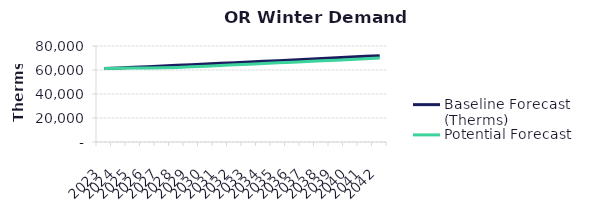
| Category | Baseline Forecast (Therms) | Potential Forecast |
|---|---|---|
| 2023.0 | 61225.348 | 61225.348 |
| 2024.0 | 61621.184 | 61460.07 |
| 2025.0 | 62189.655 | 61700.29 |
| 2026.0 | 62806.427 | 61650.526 |
| 2027.0 | 63342.783 | 61833.669 |
| 2028.0 | 63883.831 | 62181.077 |
| 2029.0 | 64429.61 | 62700.436 |
| 2030.0 | 64980.164 | 63224.098 |
| 2031.0 | 65535.535 | 63758.141 |
| 2032.0 | 66095.766 | 64296.777 |
| 2033.0 | 66660.901 | 64840.048 |
| 2034.0 | 67230.983 | 65387.993 |
| 2035.0 | 67806.056 | 65940.653 |
| 2036.0 | 68386.166 | 66498.07 |
| 2037.0 | 68971.357 | 67060.283 |
| 2038.0 | 69561.674 | 67627.337 |
| 2039.0 | 70157.163 | 68199.271 |
| 2040.0 | 70757.87 | 68776.13 |
| 2041.0 | 71363.843 | 69357.955 |
| 2042.0 | 71975.128 | 69944.791 |